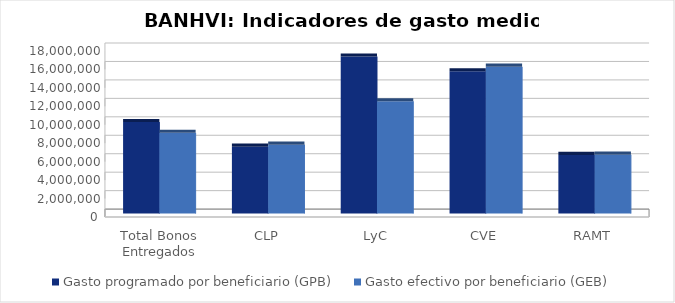
| Category | Gasto programado por beneficiario (GPB)  | Gasto efectivo por beneficiario (GEB)  |
|---|---|---|
| Total Bonos Entregados | 9920027.782 | 8748155.015 |
| CLP | 7240213.243 | 7472202.965 |
| LyC | 17018417.915 | 12168822.638 |
| CVE | 15416870.536 | 15910138.843 |
| RAMT | 6358191.156 | 6388202.166 |